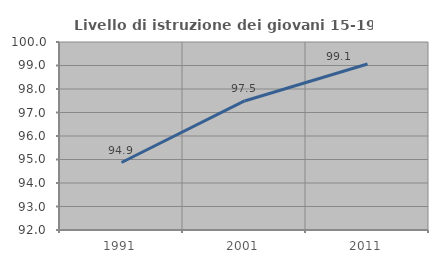
| Category | Livello di istruzione dei giovani 15-19 anni |
|---|---|
| 1991.0 | 94.872 |
| 2001.0 | 97.491 |
| 2011.0 | 99.065 |